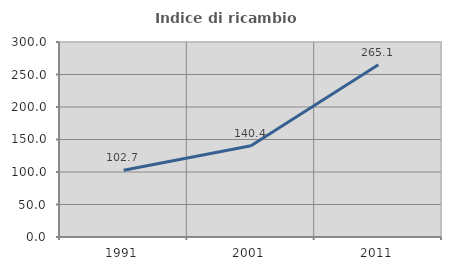
| Category | Indice di ricambio occupazionale  |
|---|---|
| 1991.0 | 102.658 |
| 2001.0 | 140.441 |
| 2011.0 | 265.072 |